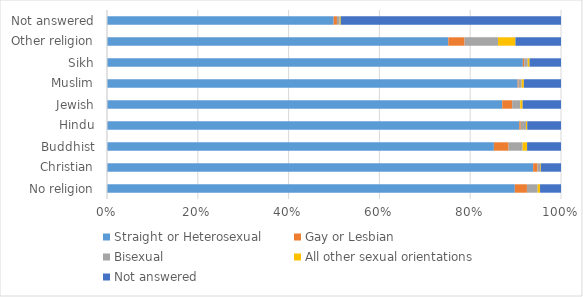
| Category | Straight or Heterosexual | Gay or Lesbian | Bisexual | All other sexual orientations | Not answered |
|---|---|---|---|---|---|
| No religion | 0.898 | 0.027 | 0.024 | 0.005 | 0.046 |
| Christian | 0.939 | 0.01 | 0.005 | 0.002 | 0.045 |
| Buddhist | 0.852 | 0.032 | 0.031 | 0.01 | 0.075 |
| Hindu | 0.908 | 0.003 | 0.012 | 0.003 | 0.074 |
| Jewish | 0.871 | 0.022 | 0.018 | 0.005 | 0.085 |
| Muslim | 0.905 | 0.002 | 0.007 | 0.005 | 0.082 |
| Sikh | 0.916 | 0.003 | 0.008 | 0.004 | 0.069 |
| Other religion | 0.752 | 0.036 | 0.074 | 0.038 | 0.1 |
| Not answered | 0.499 | 0.007 | 0.006 | 0.002 | 0.485 |